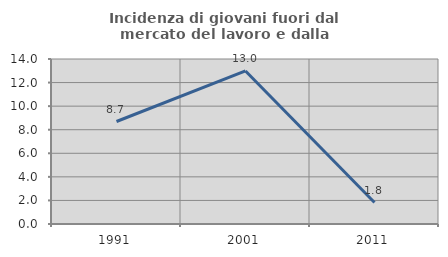
| Category | Incidenza di giovani fuori dal mercato del lavoro e dalla formazione  |
|---|---|
| 1991.0 | 8.696 |
| 2001.0 | 12.987 |
| 2011.0 | 1.818 |